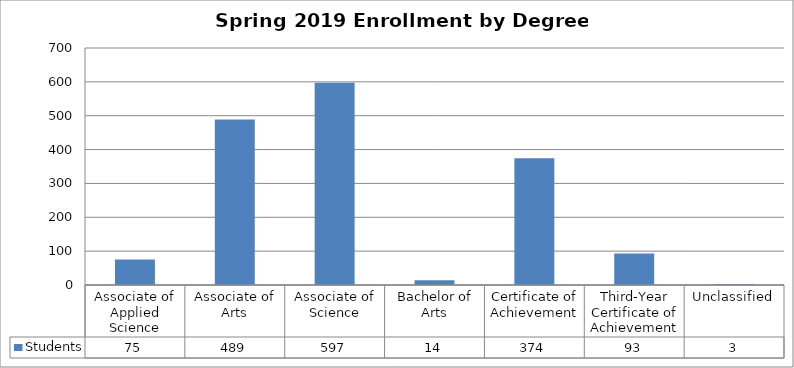
| Category | Students |
|---|---|
| Associate of Applied Science | 75 |
| Associate of Arts | 489 |
| Associate of Science | 597 |
| Bachelor of Arts | 14 |
| Certificate of Achievement | 374 |
| Third-Year Certificate of Achievement | 93 |
| Unclassified | 3 |